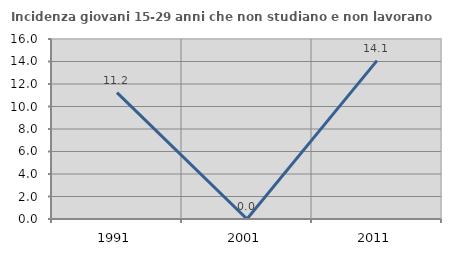
| Category | Incidenza giovani 15-29 anni che non studiano e non lavorano  |
|---|---|
| 1991.0 | 11.236 |
| 2001.0 | 0 |
| 2011.0 | 14.082 |